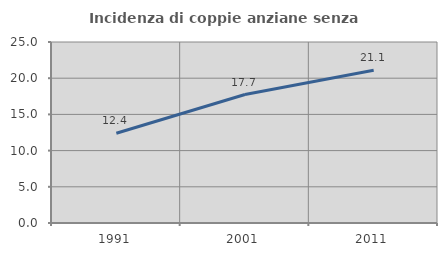
| Category | Incidenza di coppie anziane senza figli  |
|---|---|
| 1991.0 | 12.403 |
| 2001.0 | 17.742 |
| 2011.0 | 21.094 |